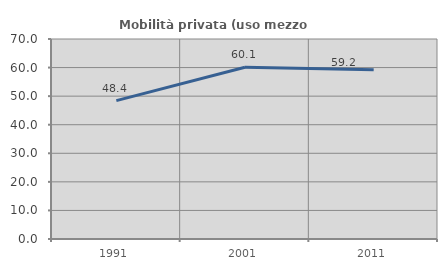
| Category | Mobilità privata (uso mezzo privato) |
|---|---|
| 1991.0 | 48.423 |
| 2001.0 | 60.093 |
| 2011.0 | 59.223 |